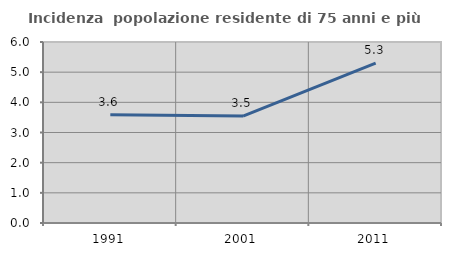
| Category | Incidenza  popolazione residente di 75 anni e più |
|---|---|
| 1991.0 | 3.592 |
| 2001.0 | 3.543 |
| 2011.0 | 5.298 |